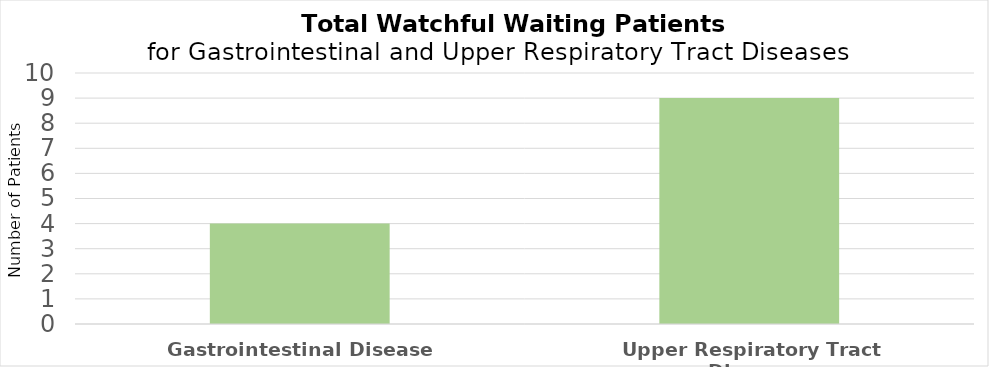
| Category | Number of Patients |
|---|---|
| Gastrointestinal Disease | 4 |
| Upper Respiratory Tract Disease | 9 |